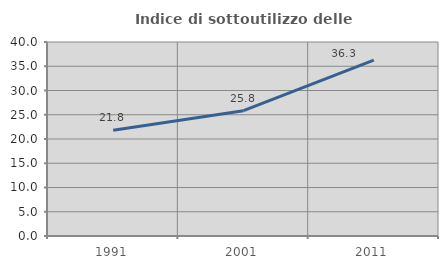
| Category | Indice di sottoutilizzo delle abitazioni  |
|---|---|
| 1991.0 | 21.786 |
| 2001.0 | 25.833 |
| 2011.0 | 36.253 |